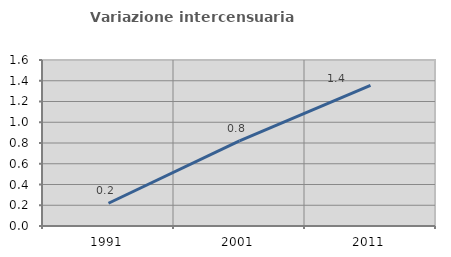
| Category | Variazione intercensuaria annua |
|---|---|
| 1991.0 | 0.219 |
| 2001.0 | 0.82 |
| 2011.0 | 1.355 |